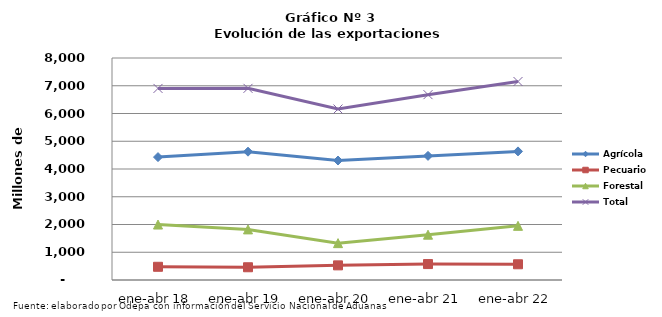
| Category | Agrícola | Pecuario | Forestal | Total |
|---|---|---|---|---|
| ene-abr 18 | 4429044 | 476014 | 1998600 | 6903658 |
| ene-abr 19 | 4623933 | 459234 | 1823263 | 6906430 |
| ene-abr 20 | 4305501 | 527364 | 1328730 | 6161595 |
| ene-abr 21 | 4472451 | 573914 | 1632960 | 6679325 |
| ene-abr 22 | 4634025 | 566854 | 1952062 | 7152941 |